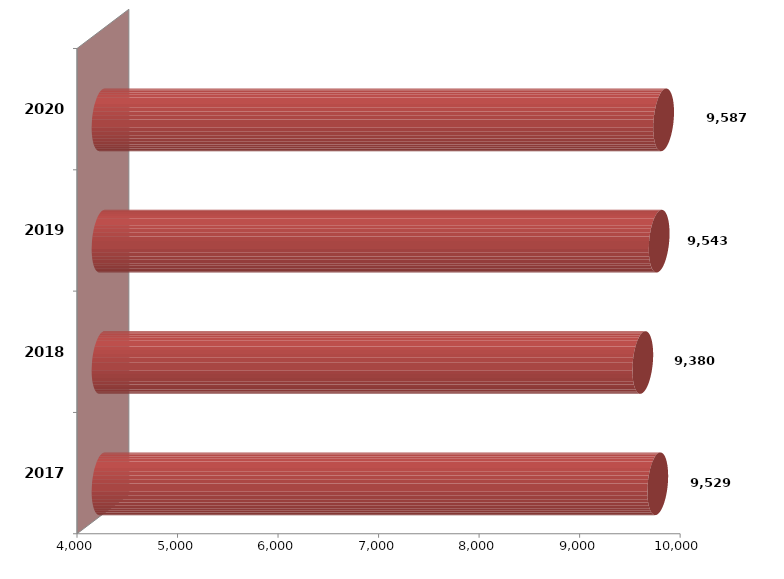
| Category | Series 1 | Series 2 |
|---|---|---|
| 2017 | 9528784.616 |  |
| 2018 | 9379792.504 |  |
| 2019 | 9542655.621 |  |
| 2020 | 9587148.134 |  |